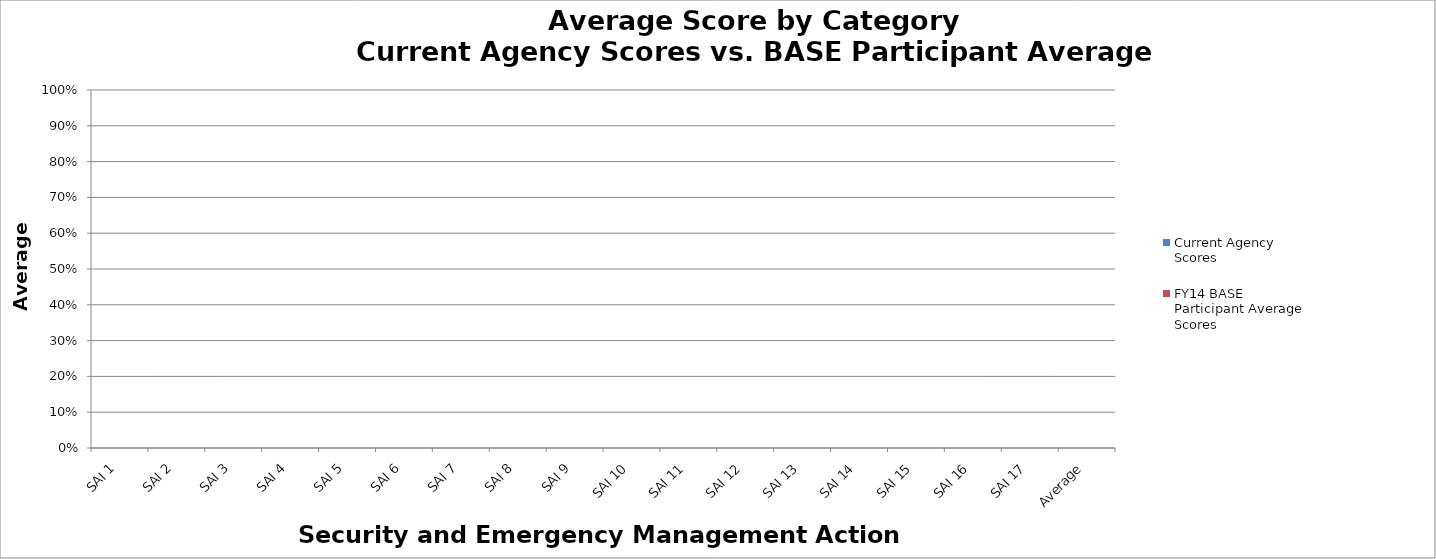
| Category | Current Agency Scores | FY14 BASE Participant Average Scores |
|---|---|---|
| SAI 1 | 0 | 0 |
| SAI 2 | 0 | 0 |
| SAI 3 | 0 | 0 |
| SAI 4 | 0 | 0 |
| SAI 5 | 0 | 0 |
| SAI 6 | 0 | 0 |
| SAI 7 | 0 | 0 |
| SAI 8 | 0 | 0 |
| SAI 9 | 0 | 0 |
| SAI 10 | 0 | 0 |
| SAI 11 | 0 | 0 |
| SAI 12 | 0 | 0 |
| SAI 13 | 0 | 0 |
| SAI 14 | 0 | 0 |
| SAI 15 | 0 | 0 |
| SAI 16 | 0 | 0 |
| SAI 17 | 0 | 0 |
| Average | 0 | 0 |